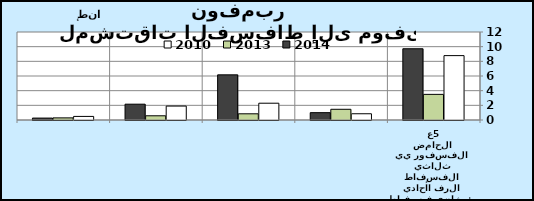
| Category | 2010 | 2013 | 2014 |
|---|---|---|---|
| 0 | 8.78 | 3.496 | 9.717 |
| 1 | 0.851 | 1.461 | 1 |
| 2 | 2.29 | 0.845 | 6.156 |
| 3 | 1.899 | 0.575 | 2.158 |
| 4 | 0.49 | 0.288 | 0.262 |